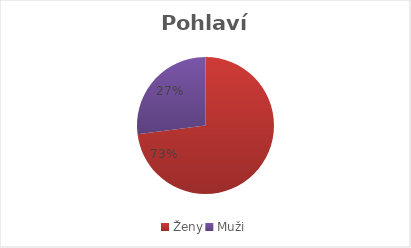
| Category | Series 0 |
|---|---|
| Ženy | 127 |
| Muži | 47 |